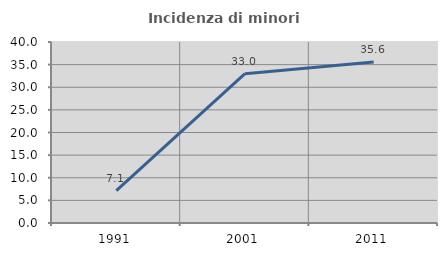
| Category | Incidenza di minori stranieri |
|---|---|
| 1991.0 | 7.143 |
| 2001.0 | 32.995 |
| 2011.0 | 35.577 |